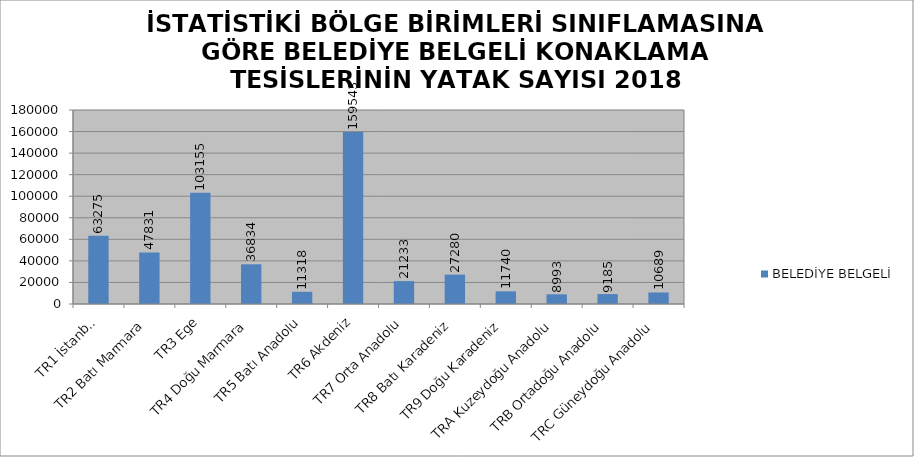
| Category | BELEDİYE BELGELİ |
|---|---|
| TR1 İstanbul | 63275 |
| TR2 Batı Marmara | 47831 |
| TR3 Ege | 103155 |
| TR4 Doğu Marmara | 36834 |
| TR5 Batı Anadolu | 11318 |
| TR6 Akdeniz | 159543 |
| TR7 Orta Anadolu | 21233 |
| TR8 Batı Karadeniz | 27280 |
| TR9 Doğu Karadeniz | 11740 |
| TRA Kuzeydoğu Anadolu | 8993 |
| TRB Ortadoğu Anadolu | 9185 |
| TRC Güneydoğu Anadolu | 10689 |